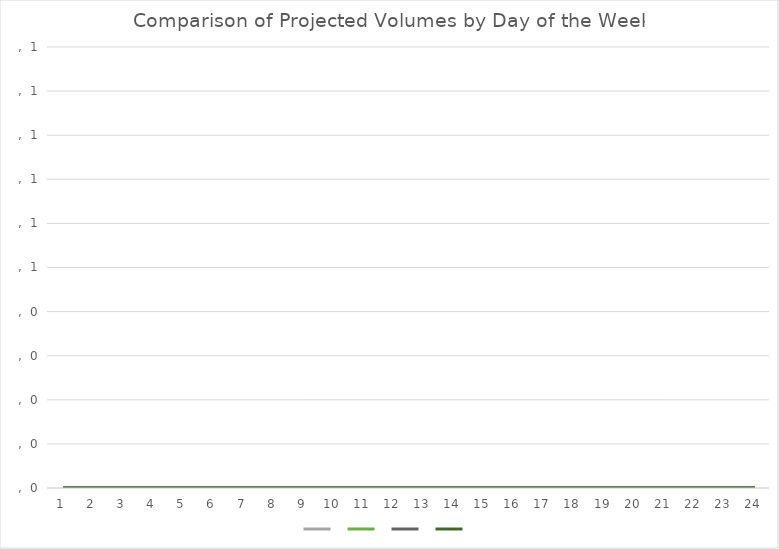
| Category | Series 2 | Series 5 | Series 8 | Series 11 |
|---|---|---|---|---|
| 0 | 0 | 0 | 0 | 0 |
| 1 | 0 | 0 | 0 | 0 |
| 2 | 0 | 0 | 0 | 0 |
| 3 | 0 | 0 | 0 | 0 |
| 4 | 0 | 0 | 0 | 0 |
| 5 | 0 | 0 | 0 | 0 |
| 6 | 0 | 0 | 0 | 0 |
| 7 | 0 | 0 | 0 | 0 |
| 8 | 0 | 0 | 0 | 0 |
| 9 | 0 | 0 | 0 | 0 |
| 10 | 0 | 0 | 0 | 0 |
| 11 | 0 | 0 | 0 | 0 |
| 12 | 0 | 0 | 0 | 0 |
| 13 | 0 | 0 | 0 | 0 |
| 14 | 0 | 0 | 0 | 0 |
| 15 | 0 | 0 | 0 | 0 |
| 16 | 0 | 0 | 0 | 0 |
| 17 | 0 | 0 | 0 | 0 |
| 18 | 0 | 0 | 0 | 0 |
| 19 | 0 | 0 | 0 | 0 |
| 20 | 0 | 0 | 0 | 0 |
| 21 | 0 | 0 | 0 | 0 |
| 22 | 0 | 0 | 0 | 0 |
| 23 | 0 | 0 | 0 | 0 |